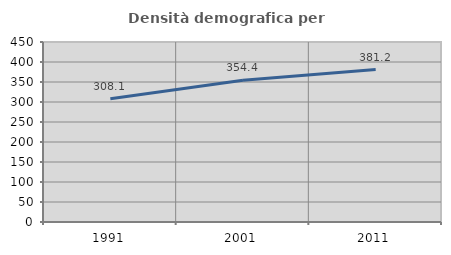
| Category | Densità demografica |
|---|---|
| 1991.0 | 308.118 |
| 2001.0 | 354.425 |
| 2011.0 | 381.248 |